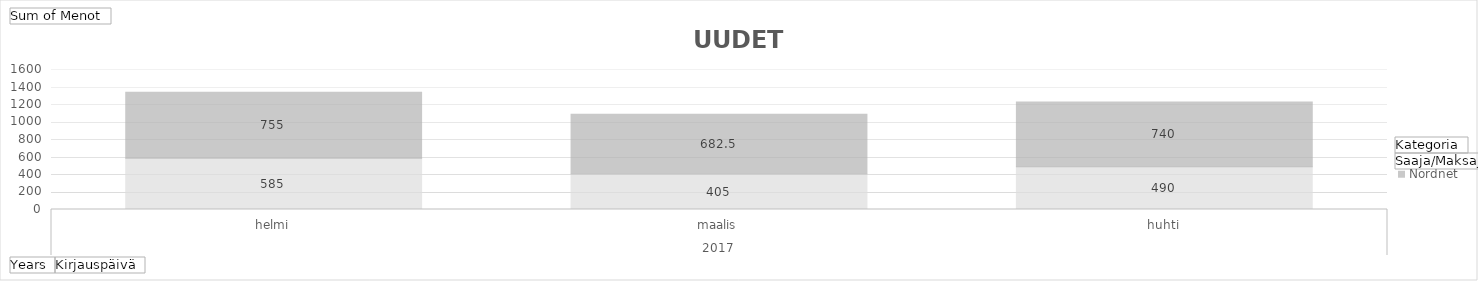
| Category | Sijoitukset - Seligson | Sijoitukset - Nordnet |
|---|---|---|
| 0 | 585 | 755 |
| 1 | 405 | 682.5 |
| 2 | 490 | 740 |